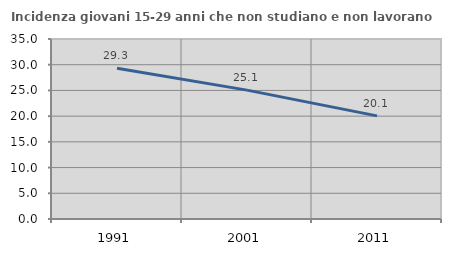
| Category | Incidenza giovani 15-29 anni che non studiano e non lavorano  |
|---|---|
| 1991.0 | 29.323 |
| 2001.0 | 25.062 |
| 2011.0 | 20.057 |